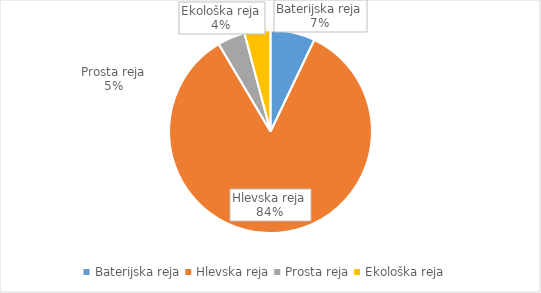
| Category | Količina kosov jajc |
|---|---|
| Baterijska reja | 197777 |
| Hlevska reja | 2352204 |
| Prosta reja | 122416 |
| Ekološka reja | 115160 |